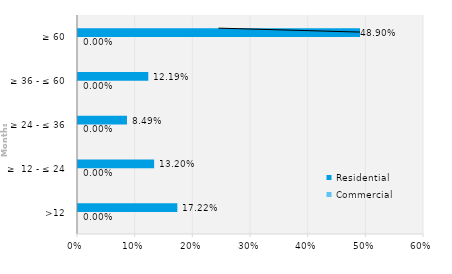
| Category | Commercial | Residential |
|---|---|---|
| >12 | 0 | 0.172 |
| ≥  12 - ≤ 24 | 0 | 0.132 |
| ≥ 24 - ≤ 36 | 0 | 0.085 |
| ≥ 36 - ≤ 60 | 0 | 0.122 |
| ≥ 60 | 0 | 0.489 |